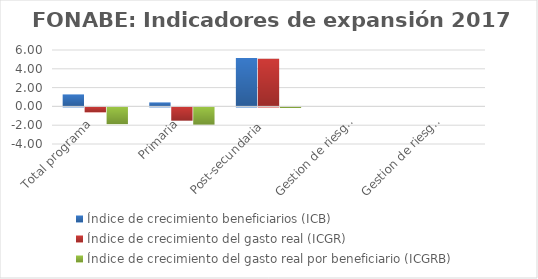
| Category | Índice de crecimiento beneficiarios (ICB)  | Índice de crecimiento del gasto real (ICGR)  | Índice de crecimiento del gasto real por beneficiario (ICGRB)  |
|---|---|---|---|
| Total programa | 1.275 | -0.529 | -1.782 |
| Primaria | 0.425 | -1.413 | -1.83 |
| Post-secundaria  | 5.146 | 5.081 | -0.061 |
| Gestion de riesgo desastre emergencia primaria | 0 | 0 | 0 |
| Gestion de riesgo desastre emergencia secundaria | 0 | 0 | 0 |